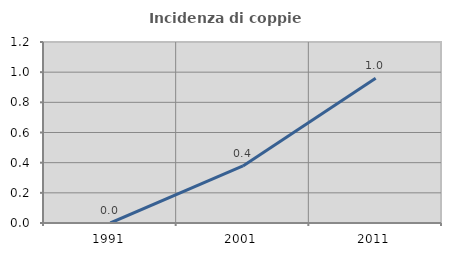
| Category | Incidenza di coppie miste |
|---|---|
| 1991.0 | 0 |
| 2001.0 | 0.378 |
| 2011.0 | 0.96 |